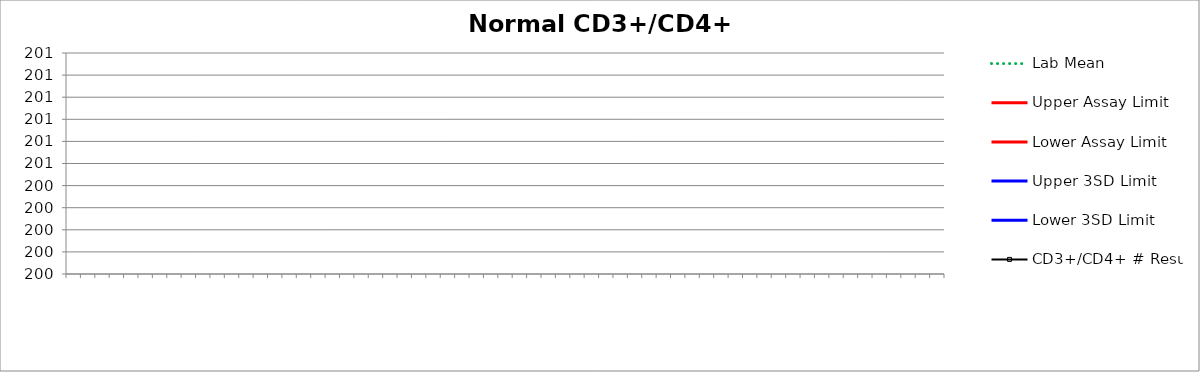
| Category | Lab Mean | Upper Assay Limit | Lower Assay Limit | Upper 3SD Limit | Lower 3SD Limit | CD3+/CD4+ # Result |
|---|---|---|---|---|---|---|
|  | 0 |  |  | 0 | 0 |  |
|  | 0 |  |  | 0 | 0 |  |
|  | 0 |  |  | 0 | 0 |  |
|  | 0 |  |  | 0 | 0 |  |
|  | 0 |  |  | 0 | 0 |  |
|  | 0 |  |  | 0 | 0 |  |
|  | 0 |  |  | 0 | 0 |  |
|  | 0 |  |  | 0 | 0 |  |
|  | 0 |  |  | 0 | 0 |  |
|  | 0 |  |  | 0 | 0 |  |
|  | 0 |  |  | 0 | 0 |  |
|  | 0 |  |  | 0 | 0 |  |
|  | 0 |  |  | 0 | 0 |  |
|  | 0 |  |  | 0 | 0 |  |
|  | 0 |  |  | 0 | 0 |  |
|  | 0 |  |  | 0 | 0 |  |
|  | 0 |  |  | 0 | 0 |  |
|  | 0 |  |  | 0 | 0 |  |
|  | 0 |  |  | 0 | 0 |  |
|  | 0 |  |  | 0 | 0 |  |
|  | 0 |  |  | 0 | 0 |  |
|  | 0 |  |  | 0 | 0 |  |
|  | 0 |  |  | 0 | 0 |  |
|  | 0 |  |  | 0 | 0 |  |
|  | 0 |  |  | 0 | 0 |  |
|  | 0 |  |  | 0 | 0 |  |
|  | 0 |  |  | 0 | 0 |  |
|  | 0 |  |  | 0 | 0 |  |
|  | 0 |  |  | 0 | 0 |  |
|  | 0 |  |  | 0 | 0 |  |
|  | 0 |  |  | 0 | 0 |  |
|  | 0 |  |  | 0 | 0 |  |
|  | 0 |  |  | 0 | 0 |  |
|  | 0 |  |  | 0 | 0 |  |
|  | 0 |  |  | 0 | 0 |  |
|  | 0 |  |  | 0 | 0 |  |
|  | 0 |  |  | 0 | 0 |  |
|  | 0 |  |  | 0 | 0 |  |
|  | 0 |  |  | 0 | 0 |  |
|  | 0 |  |  | 0 | 0 |  |
|  | 0 |  |  | 0 | 0 |  |
|  | 0 |  |  | 0 | 0 |  |
|  | 0 |  |  | 0 | 0 |  |
|  | 0 |  |  | 0 | 0 |  |
|  | 0 |  |  | 0 | 0 |  |
|  | 0 |  |  | 0 | 0 |  |
|  | 0 |  |  | 0 | 0 |  |
|  | 0 |  |  | 0 | 0 |  |
|  | 0 |  |  | 0 | 0 |  |
|  | 0 |  |  | 0 | 0 |  |
|  | 0 |  |  | 0 | 0 |  |
|  | 0 |  |  | 0 | 0 |  |
|  | 0 |  |  | 0 | 0 |  |
|  | 0 |  |  | 0 | 0 |  |
|  | 0 |  |  | 0 | 0 |  |
|  | 0 |  |  | 0 | 0 |  |
|  | 0 |  |  | 0 | 0 |  |
|  | 0 |  |  | 0 | 0 |  |
|  | 0 |  |  | 0 | 0 |  |
|  | 0 |  |  | 0 | 0 |  |
|  | 0 |  |  | 0 | 0 |  |
|  | 0 |  |  | 0 | 0 |  |